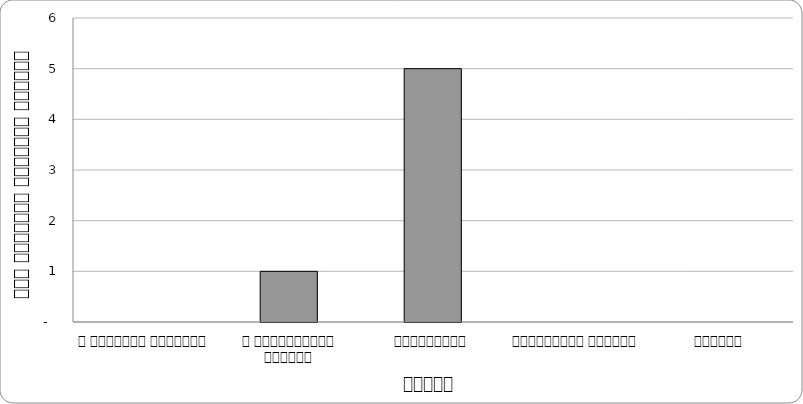
| Category | न्याय |
|---|---|
| द हिमालयन टाइम्स् | 0 |
| द काठमाण्डौं पोस्ट् | 1 |
| कान्तिपुर | 5 |
| अन्नपूर्ण पोस्ट् | 0 |
| नागरिक | 0 |